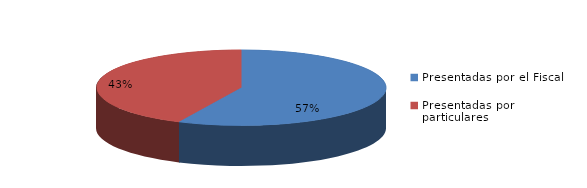
| Category | Series 0 |
|---|---|
| Presentadas por el Fiscal | 288 |
| Presentadas por particulares | 217 |